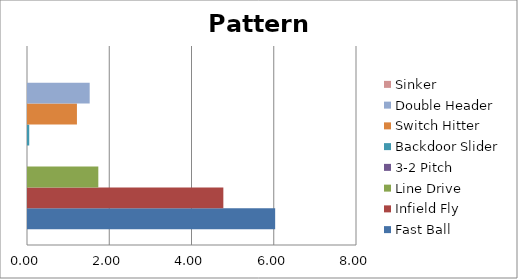
| Category | Fast Ball | Infield Fly | Line Drive | 3-2 Pitch | Backdoor Slider | Switch Hitter | Double Header | Sinker |
|---|---|---|---|---|---|---|---|---|
| 0 | 6.01 | 4.75 | 1.71 | 0 | 0.03 | 1.19 | 1.5 | 0 |